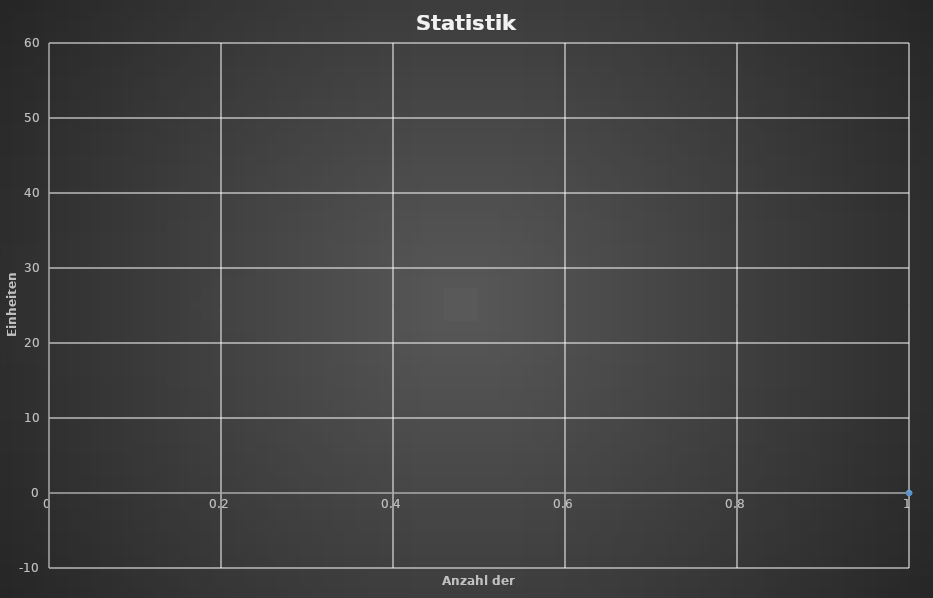
| Category | Series 0 |
|---|---|
| 0 | 0 |
| 1 | -1.5 |
| 2 | 1.375 |
| 3 | -0.625 |
| 4 | -1.625 |
| 5 | -0.51 |
| 6 | -1.51 |
| 7 | 2.705 |
| 8 | 7.25 |
| 9 | 11.425 |
| 10 | 10.425 |
| 11 | 12.675 |
| 12 | 13.815 |
| 13 | 12.315 |
| 14 | 14.375 |
| 15 | 16.1 |
| 16 | 17.675 |
| 17 | 18.651 |
| 18 | 17.651 |
| 19 | 16.651 |
| 20 | 18.738 |
| 21 | 16.738 |
| 22 | 17.908 |
| 23 | 16.408 |
| 24 | 15.408 |
| 25 | 14.408 |
| 26 | 13.408 |
| 27 | 14.758 |
| 28 | 15.706 |
| 29 | 15.656 |
| 30 | 12.656 |
| 31 | 11.156 |
| 32 | 13.496 |
| 33 | 15.496 |
| 34 | 19.536 |
| 35 | 17.536 |
| 36 | 19.196 |
| 37 | 20.902 |
| 38 | 19.402 |
| 39 | 19.9 |
| 40 | 21.265 |
| 41 | 22.275 |
| 42 | 20.775 |
| 43 | 19.775 |
| 44 | 18.775 |
| 45 | 21.775 |
| 46 | 20.275 |
| 47 | 19.275 |
| 48 | 18.275 |
| 49 | 21.515 |
| 50 | 21.015 |
| 51 | 19.765 |
| 52 | 22.393 |
| 53 | 24.161 |
| 54 | 25.511 |
| 55 | 27.919 |
| 56 | 30.007 |
| 57 | 29.507 |
| 58 | 37.507 |
| 59 | 41.307 |
| 60 | 42.407 |
| 61 | 46.669 |
| 62 | 48.469 |
| 63 | 50.432 |
| 64 | 48.932 |
| 65 | 47.932 |
| 66 | 49.432 |
| 67 | 47.432 |
| 68 | 45.932 |
| 69 | 42.932 |
| 70 | 40.932 |
| 71 | 39.932 |
| 72 | 37.932 |
| 73 | 34.932 |
| 74 | 33.932 |
| 75 | 35.572 |
| 76 | 37.503 |
| 77 | 39.163 |
| 78 | 41.503 |
| 79 | 42.308 |
| 80 | 37.308 |
| 81 | 33.308 |
| 82 | 32.308 |
| 83 | 30.808 |
| 84 | 31.508 |
| 85 | 31.008 |
| 86 | 30.008 |
| 87 | 32.708 |
| 88 | 31.708 |
| 89 | 33.308 |
| 90 | 31.308 |
| 91 | 32.558 |
| 92 | 38.738 |
| 93 | 40.253 |
| 94 | 44.333 |
| 95 | 45.583 |
| 96 | 46.693 |
| 97 | 49.693 |
| 98 | 50.533 |
| 99 | 50.033 |